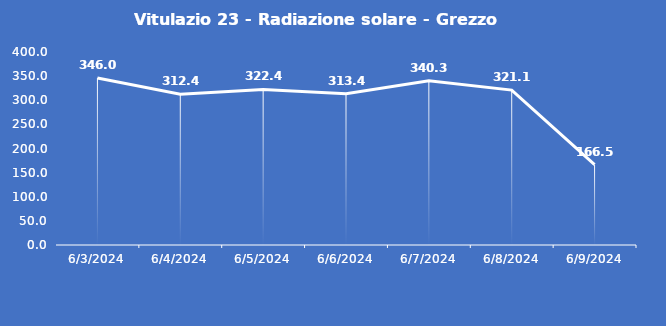
| Category | Vitulazio 23 - Radiazione solare - Grezzo (W/m2) |
|---|---|
| 6/3/24 | 346 |
| 6/4/24 | 312.4 |
| 6/5/24 | 322.4 |
| 6/6/24 | 313.4 |
| 6/7/24 | 340.3 |
| 6/8/24 | 321.1 |
| 6/9/24 | 166.5 |